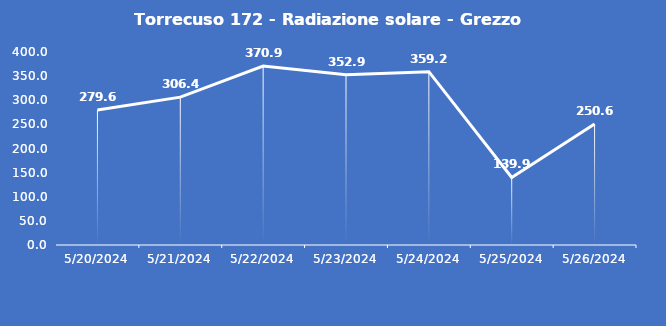
| Category | Torrecuso 172 - Radiazione solare - Grezzo (W/m2) |
|---|---|
| 5/20/24 | 279.6 |
| 5/21/24 | 306.4 |
| 5/22/24 | 370.9 |
| 5/23/24 | 352.9 |
| 5/24/24 | 359.2 |
| 5/25/24 | 139.9 |
| 5/26/24 | 250.6 |